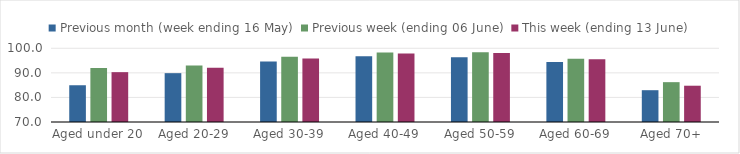
| Category | Previous month (week ending 16 May) | Previous week (ending 06 June) | This week (ending 13 June) |
|---|---|---|---|
| Aged under 20 | 84.957 | 91.991 | 90.288 |
| Aged 20-29 | 89.878 | 92.947 | 92.1 |
| Aged 30-39 | 94.585 | 96.539 | 95.862 |
| Aged 40-49 | 96.712 | 98.238 | 97.876 |
| Aged 50-59 | 96.313 | 98.437 | 98.09 |
| Aged 60-69 | 94.447 | 95.729 | 95.587 |
| Aged 70+ | 82.944 | 86.215 | 84.766 |